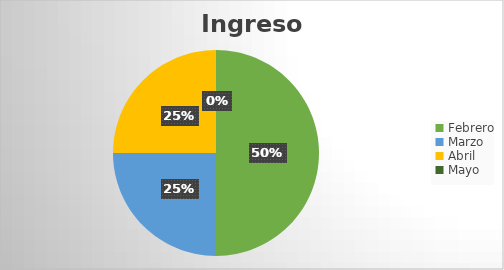
| Category | Series 0 |
|---|---|
| Febrero | 0.5 |
| Marzo | 0.25 |
| Abril | 0.25 |
| Mayo | 0 |